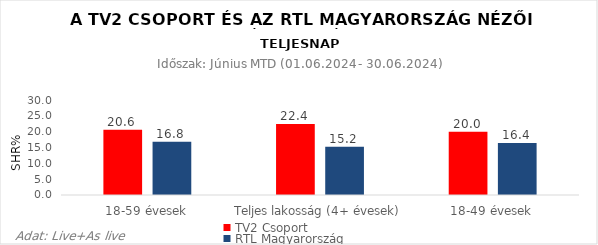
| Category | TV2 Csoport | RTL Magyarország |
|---|---|---|
| 18-59 évesek | 20.6 | 16.8 |
| Teljes lakosság (4+ évesek) | 22.4 | 15.2 |
| 18-49 évesek | 20 | 16.4 |